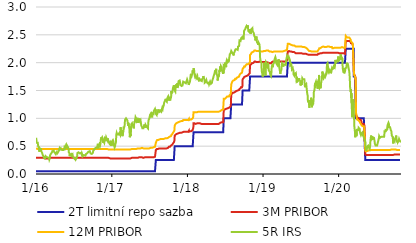
| Category | 2T limitní repo sazba | 3M PRIBOR | 12M PRIBOR | 5R IRS |
|---|---|---|---|---|
| 2016-01-04 | 0.05 | 0.29 | 0.46 | 0.65 |
| 2016-01-05 | 0.05 | 0.29 | 0.46 | 0.63 |
| 2016-01-06 | 0.05 | 0.29 | 0.46 | 0.62 |
| 2016-01-07 | 0.05 | 0.29 | 0.46 | 0.56 |
| 2016-01-08 | 0.05 | 0.29 | 0.46 | 0.57 |
| 2016-01-11 | 0.05 | 0.29 | 0.45 | 0.56 |
| 2016-01-12 | 0.05 | 0.29 | 0.45 | 0.56 |
| 2016-01-13 | 0.05 | 0.29 | 0.45 | 0.56 |
| 2016-01-14 | 0.05 | 0.29 | 0.45 | 0.5 |
| 2016-01-15 | 0.05 | 0.29 | 0.45 | 0.49 |
| 2016-01-18 | 0.05 | 0.29 | 0.45 | 0.46 |
| 2016-01-19 | 0.05 | 0.29 | 0.45 | 0.46 |
| 2016-01-20 | 0.05 | 0.29 | 0.45 | 0.4 |
| 2016-01-21 | 0.05 | 0.29 | 0.45 | 0.43 |
| 2016-01-22 | 0.05 | 0.29 | 0.45 | 0.46 |
| 2016-01-25 | 0.05 | 0.29 | 0.45 | 0.45 |
| 2016-01-26 | 0.05 | 0.29 | 0.45 | 0.44 |
| 2016-01-27 | 0.05 | 0.29 | 0.45 | 0.46 |
| 2016-01-28 | 0.05 | 0.29 | 0.45 | 0.44 |
| 2016-01-29 | 0.05 | 0.29 | 0.45 | 0.41 |
| 2016-02-01 | 0.05 | 0.29 | 0.45 | 0.4 |
| 2016-02-02 | 0.05 | 0.29 | 0.45 | 0.38 |
| 2016-02-03 | 0.05 | 0.29 | 0.45 | 0.37 |
| 2016-02-04 | 0.05 | 0.29 | 0.45 | 0.37 |
| 2016-02-05 | 0.05 | 0.29 | 0.45 | 0.34 |
| 2016-02-08 | 0.05 | 0.29 | 0.45 | 0.32 |
| 2016-02-09 | 0.05 | 0.28 | 0.45 | 0.31 |
| 2016-02-10 | 0.05 | 0.28 | 0.45 | 0.31 |
| 2016-02-11 | 0.05 | 0.28 | 0.45 | 0.29 |
| 2016-02-12 | 0.05 | 0.28 | 0.45 | 0.28 |
| 2016-02-15 | 0.05 | 0.28 | 0.45 | 0.28 |
| 2016-02-16 | 0.05 | 0.28 | 0.45 | 0.28 |
| 2016-02-17 | 0.05 | 0.28 | 0.45 | 0.28 |
| 2016-02-18 | 0.05 | 0.28 | 0.45 | 0.3 |
| 2016-02-19 | 0.05 | 0.28 | 0.45 | 0.32 |
| 2016-02-22 | 0.05 | 0.28 | 0.45 | 0.32 |
| 2016-02-23 | 0.05 | 0.28 | 0.45 | 0.32 |
| 2016-02-24 | 0.05 | 0.28 | 0.45 | 0.3 |
| 2016-02-25 | 0.05 | 0.28 | 0.45 | 0.3 |
| 2016-02-26 | 0.05 | 0.28 | 0.45 | 0.31 |
| 2016-02-29 | 0.05 | 0.28 | 0.45 | 0.3 |
| 2016-03-01 | 0.05 | 0.28 | 0.45 | 0.29 |
| 2016-03-02 | 0.05 | 0.28 | 0.45 | 0.31 |
| 2016-03-03 | 0.05 | 0.28 | 0.45 | 0.3 |
| 2016-03-04 | 0.05 | 0.28 | 0.45 | 0.29 |
| 2016-03-07 | 0.05 | 0.28 | 0.45 | 0.28 |
| 2016-03-08 | 0.05 | 0.28 | 0.45 | 0.26 |
| 2016-03-09 | 0.05 | 0.28 | 0.45 | 0.26 |
| 2016-03-10 | 0.05 | 0.28 | 0.45 | 0.28 |
| 2016-03-11 | 0.05 | 0.29 | 0.45 | 0.33 |
| 2016-03-14 | 0.05 | 0.29 | 0.45 | 0.34 |
| 2016-03-15 | 0.05 | 0.29 | 0.45 | 0.36 |
| 2016-03-16 | 0.05 | 0.29 | 0.45 | 0.37 |
| 2016-03-17 | 0.05 | 0.29 | 0.45 | 0.37 |
| 2016-03-18 | 0.05 | 0.29 | 0.45 | 0.37 |
| 2016-03-21 | 0.05 | 0.29 | 0.45 | 0.39 |
| 2016-03-22 | 0.05 | 0.29 | 0.45 | 0.41 |
| 2016-03-23 | 0.05 | 0.29 | 0.45 | 0.41 |
| 2016-03-24 | 0.05 | 0.29 | 0.45 | 0.4 |
| 2016-03-29 | 0.05 | 0.29 | 0.45 | 0.42 |
| 2016-03-30 | 0.05 | 0.29 | 0.45 | 0.4 |
| 2016-03-31 | 0.05 | 0.29 | 0.45 | 0.4 |
| 2016-04-01 | 0.05 | 0.29 | 0.45 | 0.4 |
| 2016-04-04 | 0.05 | 0.29 | 0.45 | 0.38 |
| 2016-04-05 | 0.05 | 0.29 | 0.45 | 0.37 |
| 2016-04-06 | 0.05 | 0.29 | 0.45 | 0.38 |
| 2016-04-07 | 0.05 | 0.29 | 0.45 | 0.36 |
| 2016-04-08 | 0.05 | 0.29 | 0.45 | 0.36 |
| 2016-04-11 | 0.05 | 0.29 | 0.45 | 0.35 |
| 2016-04-12 | 0.05 | 0.29 | 0.45 | 0.39 |
| 2016-04-13 | 0.05 | 0.29 | 0.45 | 0.37 |
| 2016-04-14 | 0.05 | 0.29 | 0.45 | 0.39 |
| 2016-04-15 | 0.05 | 0.29 | 0.45 | 0.37 |
| 2016-04-18 | 0.05 | 0.29 | 0.45 | 0.37 |
| 2016-04-19 | 0.05 | 0.29 | 0.45 | 0.39 |
| 2016-04-20 | 0.05 | 0.29 | 0.45 | 0.38 |
| 2016-04-21 | 0.05 | 0.29 | 0.45 | 0.41 |
| 2016-04-22 | 0.05 | 0.29 | 0.45 | 0.41 |
| 2016-04-25 | 0.05 | 0.29 | 0.45 | 0.42 |
| 2016-04-26 | 0.05 | 0.29 | 0.45 | 0.46 |
| 2016-04-27 | 0.05 | 0.29 | 0.45 | 0.46 |
| 2016-04-28 | 0.05 | 0.29 | 0.45 | 0.44 |
| 2016-04-29 | 0.05 | 0.29 | 0.45 | 0.45 |
| 2016-05-02 | 0.05 | 0.29 | 0.45 | 0.46 |
| 2016-05-03 | 0.05 | 0.29 | 0.45 | 0.46 |
| 2016-05-04 | 0.05 | 0.29 | 0.45 | 0.44 |
| 2016-05-05 | 0.05 | 0.29 | 0.45 | 0.45 |
| 2016-05-06 | 0.05 | 0.29 | 0.45 | 0.44 |
| 2016-05-09 | 0.05 | 0.29 | 0.45 | 0.43 |
| 2016-05-10 | 0.05 | 0.29 | 0.45 | 0.44 |
| 2016-05-11 | 0.05 | 0.29 | 0.45 | 0.43 |
| 2016-05-12 | 0.05 | 0.29 | 0.45 | 0.42 |
| 2016-05-13 | 0.05 | 0.29 | 0.45 | 0.43 |
| 2016-05-16 | 0.05 | 0.29 | 0.45 | 0.43 |
| 2016-05-17 | 0.05 | 0.29 | 0.45 | 0.44 |
| 2016-05-18 | 0.05 | 0.29 | 0.45 | 0.44 |
| 2016-05-19 | 0.05 | 0.29 | 0.45 | 0.46 |
| 2016-05-20 | 0.05 | 0.29 | 0.45 | 0.48 |
| 2016-05-23 | 0.05 | 0.29 | 0.45 | 0.46 |
| 2016-05-24 | 0.05 | 0.29 | 0.45 | 0.46 |
| 2016-05-25 | 0.05 | 0.29 | 0.45 | 0.48 |
| 2016-05-26 | 0.05 | 0.29 | 0.45 | 0.48 |
| 2016-05-27 | 0.05 | 0.29 | 0.45 | 0.51 |
| 2016-05-30 | 0.05 | 0.29 | 0.45 | 0.49 |
| 2016-05-31 | 0.05 | 0.29 | 0.45 | 0.52 |
| 2016-06-01 | 0.05 | 0.29 | 0.45 | 0.51 |
| 2016-06-02 | 0.05 | 0.29 | 0.45 | 0.51 |
| 2016-06-03 | 0.05 | 0.29 | 0.45 | 0.51 |
| 2016-06-06 | 0.05 | 0.29 | 0.45 | 0.48 |
| 2016-06-07 | 0.05 | 0.29 | 0.45 | 0.49 |
| 2016-06-08 | 0.05 | 0.29 | 0.45 | 0.47 |
| 2016-06-09 | 0.05 | 0.29 | 0.45 | 0.45 |
| 2016-06-10 | 0.05 | 0.29 | 0.45 | 0.39 |
| 2016-06-13 | 0.05 | 0.29 | 0.45 | 0.37 |
| 2016-06-14 | 0.05 | 0.29 | 0.45 | 0.32 |
| 2016-06-15 | 0.05 | 0.29 | 0.45 | 0.32 |
| 2016-06-16 | 0.05 | 0.29 | 0.45 | 0.32 |
| 2016-06-17 | 0.05 | 0.29 | 0.45 | 0.35 |
| 2016-06-20 | 0.05 | 0.29 | 0.45 | 0.35 |
| 2016-06-21 | 0.05 | 0.29 | 0.45 | 0.36 |
| 2016-06-22 | 0.05 | 0.29 | 0.45 | 0.36 |
| 2016-06-23 | 0.05 | 0.29 | 0.45 | 0.36 |
| 2016-06-24 | 0.05 | 0.29 | 0.45 | 0.33 |
| 2016-06-27 | 0.05 | 0.29 | 0.45 | 0.32 |
| 2016-06-28 | 0.05 | 0.29 | 0.45 | 0.35 |
| 2016-06-29 | 0.05 | 0.29 | 0.45 | 0.33 |
| 2016-06-30 | 0.05 | 0.29 | 0.45 | 0.31 |
| 2016-07-01 | 0.05 | 0.29 | 0.45 | 0.31 |
| 2016-07-04 | 0.05 | 0.29 | 0.45 | 0.29 |
| 2016-07-07 | 0.05 | 0.29 | 0.45 | 0.28 |
| 2016-07-08 | 0.05 | 0.29 | 0.45 | 0.28 |
| 2016-07-11 | 0.05 | 0.29 | 0.45 | 0.26 |
| 2016-07-12 | 0.05 | 0.29 | 0.45 | 0.3 |
| 2016-07-13 | 0.05 | 0.29 | 0.45 | 0.29 |
| 2016-07-14 | 0.05 | 0.29 | 0.45 | 0.27 |
| 2016-07-15 | 0.05 | 0.29 | 0.45 | 0.28 |
| 2016-07-18 | 0.05 | 0.29 | 0.45 | 0.29 |
| 2016-07-19 | 0.05 | 0.29 | 0.45 | 0.28 |
| 2016-07-20 | 0.05 | 0.29 | 0.45 | 0.32 |
| 2016-07-21 | 0.05 | 0.29 | 0.45 | 0.36 |
| 2016-07-22 | 0.05 | 0.29 | 0.45 | 0.38 |
| 2016-07-25 | 0.05 | 0.29 | 0.45 | 0.38 |
| 2016-07-26 | 0.05 | 0.29 | 0.45 | 0.38 |
| 2016-07-27 | 0.05 | 0.29 | 0.45 | 0.39 |
| 2016-07-28 | 0.05 | 0.29 | 0.45 | 0.38 |
| 2016-07-29 | 0.05 | 0.29 | 0.45 | 0.38 |
| 2016-08-01 | 0.05 | 0.29 | 0.45 | 0.37 |
| 2016-08-02 | 0.05 | 0.29 | 0.45 | 0.37 |
| 2016-08-03 | 0.05 | 0.29 | 0.45 | 0.37 |
| 2016-08-04 | 0.05 | 0.29 | 0.45 | 0.38 |
| 2016-08-05 | 0.05 | 0.29 | 0.45 | 0.38 |
| 2016-08-08 | 0.05 | 0.29 | 0.45 | 0.38 |
| 2016-08-09 | 0.05 | 0.29 | 0.45 | 0.37 |
| 2016-08-10 | 0.05 | 0.29 | 0.45 | 0.37 |
| 2016-08-11 | 0.05 | 0.29 | 0.45 | 0.35 |
| 2016-08-12 | 0.05 | 0.29 | 0.45 | 0.37 |
| 2016-08-15 | 0.05 | 0.29 | 0.45 | 0.34 |
| 2016-08-16 | 0.05 | 0.29 | 0.45 | 0.32 |
| 2016-08-17 | 0.05 | 0.29 | 0.45 | 0.33 |
| 2016-08-18 | 0.05 | 0.29 | 0.45 | 0.33 |
| 2016-08-19 | 0.05 | 0.29 | 0.45 | 0.33 |
| 2016-08-22 | 0.05 | 0.29 | 0.45 | 0.34 |
| 2016-08-23 | 0.05 | 0.29 | 0.45 | 0.33 |
| 2016-08-24 | 0.05 | 0.29 | 0.45 | 0.33 |
| 2016-08-25 | 0.05 | 0.29 | 0.45 | 0.33 |
| 2016-08-26 | 0.05 | 0.29 | 0.45 | 0.33 |
| 2016-08-29 | 0.05 | 0.29 | 0.45 | 0.33 |
| 2016-08-30 | 0.05 | 0.29 | 0.45 | 0.33 |
| 2016-08-31 | 0.05 | 0.29 | 0.45 | 0.34 |
| 2016-09-01 | 0.05 | 0.29 | 0.45 | 0.36 |
| 2016-09-02 | 0.05 | 0.29 | 0.45 | 0.36 |
| 2016-09-05 | 0.05 | 0.29 | 0.45 | 0.37 |
| 2016-09-06 | 0.05 | 0.29 | 0.45 | 0.37 |
| 2016-09-07 | 0.05 | 0.29 | 0.45 | 0.36 |
| 2016-09-08 | 0.05 | 0.29 | 0.45 | 0.36 |
| 2016-09-09 | 0.05 | 0.29 | 0.45 | 0.38 |
| 2016-09-12 | 0.05 | 0.29 | 0.45 | 0.4 |
| 2016-09-13 | 0.05 | 0.29 | 0.45 | 0.4 |
| 2016-09-14 | 0.05 | 0.29 | 0.45 | 0.4 |
| 2016-09-15 | 0.05 | 0.29 | 0.45 | 0.41 |
| 2016-09-16 | 0.05 | 0.29 | 0.45 | 0.41 |
| 2016-09-19 | 0.05 | 0.29 | 0.45 | 0.41 |
| 2016-09-20 | 0.05 | 0.29 | 0.45 | 0.41 |
| 2016-09-21 | 0.05 | 0.29 | 0.45 | 0.39 |
| 2016-09-22 | 0.05 | 0.29 | 0.45 | 0.38 |
| 2016-09-23 | 0.05 | 0.29 | 0.45 | 0.37 |
| 2016-09-26 | 0.05 | 0.29 | 0.45 | 0.36 |
| 2016-09-27 | 0.05 | 0.29 | 0.45 | 0.36 |
| 2016-09-29 | 0.05 | 0.29 | 0.45 | 0.36 |
| 2016-09-30 | 0.05 | 0.29 | 0.45 | 0.36 |
| 2016-10-03 | 0.05 | 0.29 | 0.45 | 0.37 |
| 2016-10-04 | 0.05 | 0.29 | 0.45 | 0.38 |
| 2016-10-05 | 0.05 | 0.29 | 0.45 | 0.39 |
| 2016-10-06 | 0.05 | 0.29 | 0.45 | 0.42 |
| 2016-10-07 | 0.05 | 0.29 | 0.45 | 0.42 |
| 2016-10-10 | 0.05 | 0.29 | 0.45 | 0.43 |
| 2016-10-11 | 0.05 | 0.29 | 0.45 | 0.44 |
| 2016-10-12 | 0.05 | 0.29 | 0.45 | 0.44 |
| 2016-10-13 | 0.05 | 0.29 | 0.45 | 0.45 |
| 2016-10-14 | 0.05 | 0.29 | 0.45 | 0.45 |
| 2016-10-17 | 0.05 | 0.29 | 0.45 | 0.47 |
| 2016-10-18 | 0.05 | 0.29 | 0.45 | 0.47 |
| 2016-10-19 | 0.05 | 0.29 | 0.45 | 0.47 |
| 2016-10-20 | 0.05 | 0.29 | 0.45 | 0.48 |
| 2016-10-21 | 0.05 | 0.29 | 0.45 | 0.48 |
| 2016-10-24 | 0.05 | 0.29 | 0.45 | 0.48 |
| 2016-10-25 | 0.05 | 0.29 | 0.45 | 0.46 |
| 2016-10-26 | 0.05 | 0.29 | 0.45 | 0.48 |
| 2016-10-27 | 0.05 | 0.29 | 0.45 | 0.53 |
| 2016-10-31 | 0.05 | 0.29 | 0.45 | 0.54 |
| 2016-11-01 | 0.05 | 0.29 | 0.45 | 0.53 |
| 2016-11-02 | 0.05 | 0.29 | 0.45 | 0.51 |
| 2016-11-03 | 0.05 | 0.29 | 0.45 | 0.52 |
| 2016-11-04 | 0.05 | 0.29 | 0.45 | 0.53 |
| 2016-11-07 | 0.05 | 0.29 | 0.45 | 0.5 |
| 2016-11-08 | 0.05 | 0.29 | 0.45 | 0.49 |
| 2016-11-09 | 0.05 | 0.29 | 0.45 | 0.51 |
| 2016-11-10 | 0.05 | 0.29 | 0.45 | 0.55 |
| 2016-11-11 | 0.05 | 0.29 | 0.45 | 0.61 |
| 2016-11-14 | 0.05 | 0.29 | 0.45 | 0.66 |
| 2016-11-15 | 0.05 | 0.29 | 0.45 | 0.64 |
| 2016-11-16 | 0.05 | 0.29 | 0.45 | 0.65 |
| 2016-11-18 | 0.05 | 0.29 | 0.45 | 0.66 |
| 2016-11-21 | 0.05 | 0.29 | 0.45 | 0.63 |
| 2016-11-22 | 0.05 | 0.29 | 0.45 | 0.6 |
| 2016-11-23 | 0.05 | 0.29 | 0.45 | 0.56 |
| 2016-11-24 | 0.05 | 0.29 | 0.45 | 0.59 |
| 2016-11-25 | 0.05 | 0.29 | 0.45 | 0.59 |
| 2016-11-28 | 0.05 | 0.29 | 0.45 | 0.56 |
| 2016-11-29 | 0.05 | 0.29 | 0.45 | 0.56 |
| 2016-11-30 | 0.05 | 0.29 | 0.45 | 0.57 |
| 2016-12-01 | 0.05 | 0.29 | 0.45 | 0.64 |
| 2016-12-02 | 0.05 | 0.29 | 0.45 | 0.63 |
| 2016-12-05 | 0.05 | 0.29 | 0.45 | 0.62 |
| 2016-12-06 | 0.05 | 0.29 | 0.45 | 0.64 |
| 2016-12-07 | 0.05 | 0.29 | 0.45 | 0.66 |
| 2016-12-08 | 0.05 | 0.29 | 0.45 | 0.66 |
| 2016-12-09 | 0.05 | 0.29 | 0.45 | 0.64 |
| 2016-12-12 | 0.05 | 0.29 | 0.45 | 0.65 |
| 2016-12-13 | 0.05 | 0.29 | 0.45 | 0.63 |
| 2016-12-14 | 0.05 | 0.29 | 0.45 | 0.6 |
| 2016-12-15 | 0.05 | 0.29 | 0.45 | 0.64 |
| 2016-12-16 | 0.05 | 0.29 | 0.45 | 0.62 |
| 2016-12-19 | 0.05 | 0.29 | 0.44 | 0.59 |
| 2016-12-20 | 0.05 | 0.29 | 0.44 | 0.57 |
| 2016-12-21 | 0.05 | 0.29 | 0.44 | 0.56 |
| 2016-12-22 | 0.05 | 0.28 | 0.44 | 0.57 |
| 2016-12-23 | 0.05 | 0.28 | 0.44 | 0.55 |
| 2016-12-27 | 0.05 | 0.28 | 0.44 | 0.57 |
| 2016-12-28 | 0.05 | 0.27 | 0.43 | 0.54 |
| 2016-12-29 | 0.05 | 0.28 | 0.44 | 0.52 |
| 2016-12-30 | 0.05 | 0.28 | 0.44 | 0.52 |
| 2017-01-02 | 0.05 | 0.28 | 0.44 | 0.52 |
| 2017-01-03 | 0.05 | 0.28 | 0.44 | 0.52 |
| 2017-01-04 | 0.05 | 0.28 | 0.44 | 0.57 |
| 2017-01-05 | 0.05 | 0.28 | 0.44 | 0.59 |
| 2017-01-06 | 0.05 | 0.28 | 0.44 | 0.58 |
| 2017-01-09 | 0.05 | 0.28 | 0.44 | 0.61 |
| 2017-01-10 | 0.05 | 0.28 | 0.44 | 0.6 |
| 2017-01-11 | 0.05 | 0.28 | 0.44 | 0.59 |
| 2017-01-12 | 0.05 | 0.28 | 0.44 | 0.56 |
| 2017-01-13 | 0.05 | 0.28 | 0.44 | 0.52 |
| 2017-01-16 | 0.05 | 0.28 | 0.44 | 0.5 |
| 2017-01-17 | 0.05 | 0.28 | 0.44 | 0.48 |
| 2017-01-18 | 0.05 | 0.28 | 0.44 | 0.48 |
| 2017-01-19 | 0.05 | 0.28 | 0.44 | 0.5 |
| 2017-01-20 | 0.05 | 0.28 | 0.44 | 0.53 |
| 2017-01-23 | 0.05 | 0.28 | 0.44 | 0.56 |
| 2017-01-24 | 0.05 | 0.28 | 0.44 | 0.62 |
| 2017-01-25 | 0.05 | 0.28 | 0.44 | 0.7 |
| 2017-01-26 | 0.05 | 0.28 | 0.44 | 0.7 |
| 2017-01-27 | 0.05 | 0.28 | 0.44 | 0.74 |
| 2017-01-30 | 0.05 | 0.28 | 0.44 | 0.71 |
| 2017-01-31 | 0.05 | 0.28 | 0.44 | 0.71 |
| 2017-02-01 | 0.05 | 0.28 | 0.44 | 0.7 |
| 2017-02-02 | 0.05 | 0.28 | 0.44 | 0.72 |
| 2017-02-03 | 0.05 | 0.28 | 0.44 | 0.71 |
| 2017-02-06 | 0.05 | 0.28 | 0.44 | 0.71 |
| 2017-02-07 | 0.05 | 0.28 | 0.44 | 0.74 |
| 2017-02-08 | 0.05 | 0.28 | 0.44 | 0.75 |
| 2017-02-09 | 0.05 | 0.28 | 0.44 | 0.7 |
| 2017-02-10 | 0.05 | 0.28 | 0.44 | 0.72 |
| 2017-02-13 | 0.05 | 0.28 | 0.44 | 0.7 |
| 2017-02-14 | 0.05 | 0.28 | 0.44 | 0.77 |
| 2017-02-15 | 0.05 | 0.28 | 0.44 | 0.84 |
| 2017-02-16 | 0.05 | 0.28 | 0.44 | 0.83 |
| 2017-02-17 | 0.05 | 0.28 | 0.44 | 0.76 |
| 2017-02-20 | 0.05 | 0.28 | 0.44 | 0.79 |
| 2017-02-21 | 0.05 | 0.28 | 0.44 | 0.8 |
| 2017-02-22 | 0.05 | 0.28 | 0.44 | 0.78 |
| 2017-02-23 | 0.05 | 0.28 | 0.44 | 0.7 |
| 2017-02-24 | 0.05 | 0.28 | 0.44 | 0.68 |
| 2017-02-27 | 0.05 | 0.28 | 0.44 | 0.68 |
| 2017-02-28 | 0.05 | 0.28 | 0.44 | 0.77 |
| 2017-03-01 | 0.05 | 0.28 | 0.44 | 0.77 |
| 2017-03-02 | 0.05 | 0.28 | 0.44 | 0.85 |
| 2017-03-03 | 0.05 | 0.28 | 0.44 | 0.83 |
| 2017-03-06 | 0.05 | 0.28 | 0.44 | 0.86 |
| 2017-03-07 | 0.05 | 0.28 | 0.44 | 0.87 |
| 2017-03-08 | 0.05 | 0.28 | 0.44 | 0.96 |
| 2017-03-09 | 0.05 | 0.28 | 0.44 | 0.98 |
| 2017-03-10 | 0.05 | 0.28 | 0.44 | 0.99 |
| 2017-03-13 | 0.05 | 0.28 | 0.44 | 1 |
| 2017-03-14 | 0.05 | 0.28 | 0.44 | 1 |
| 2017-03-15 | 0.05 | 0.28 | 0.44 | 0.99 |
| 2017-03-16 | 0.05 | 0.28 | 0.44 | 0.99 |
| 2017-03-17 | 0.05 | 0.28 | 0.44 | 0.99 |
| 2017-03-20 | 0.05 | 0.28 | 0.44 | 0.96 |
| 2017-03-21 | 0.05 | 0.28 | 0.44 | 0.97 |
| 2017-03-22 | 0.05 | 0.28 | 0.44 | 0.9 |
| 2017-03-23 | 0.05 | 0.28 | 0.44 | 0.87 |
| 2017-03-24 | 0.05 | 0.28 | 0.44 | 0.92 |
| 2017-03-27 | 0.05 | 0.28 | 0.44 | 0.86 |
| 2017-03-28 | 0.05 | 0.28 | 0.44 | 0.84 |
| 2017-03-29 | 0.05 | 0.28 | 0.44 | 0.84 |
| 2017-03-30 | 0.05 | 0.28 | 0.44 | 0.8 |
| 2017-03-31 | 0.05 | 0.28 | 0.44 | 0.66 |
| 2017-04-03 | 0.05 | 0.28 | 0.44 | 0.71 |
| 2017-04-04 | 0.05 | 0.28 | 0.44 | 0.68 |
| 2017-04-05 | 0.05 | 0.28 | 0.44 | 0.73 |
| 2017-04-06 | 0.05 | 0.28 | 0.44 | 0.76 |
| 2017-04-07 | 0.05 | 0.29 | 0.44 | 0.89 |
| 2017-04-10 | 0.05 | 0.29 | 0.45 | 0.89 |
| 2017-04-11 | 0.05 | 0.29 | 0.45 | 0.91 |
| 2017-04-12 | 0.05 | 0.29 | 0.45 | 0.89 |
| 2017-04-13 | 0.05 | 0.29 | 0.45 | 0.88 |
| 2017-04-18 | 0.05 | 0.29 | 0.45 | 0.85 |
| 2017-04-19 | 0.05 | 0.29 | 0.45 | 0.82 |
| 2017-04-20 | 0.05 | 0.29 | 0.45 | 0.87 |
| 2017-04-21 | 0.05 | 0.29 | 0.45 | 0.88 |
| 2017-04-24 | 0.05 | 0.29 | 0.45 | 0.95 |
| 2017-04-25 | 0.05 | 0.29 | 0.45 | 0.93 |
| 2017-04-26 | 0.05 | 0.29 | 0.45 | 0.94 |
| 2017-04-27 | 0.05 | 0.29 | 0.45 | 0.99 |
| 2017-04-28 | 0.05 | 0.29 | 0.45 | 1.02 |
| 2017-05-02 | 0.05 | 0.29 | 0.45 | 1.02 |
| 2017-05-03 | 0.05 | 0.29 | 0.45 | 0.98 |
| 2017-05-04 | 0.05 | 0.29 | 0.45 | 1.01 |
| 2017-05-05 | 0.05 | 0.29 | 0.45 | 0.95 |
| 2017-05-09 | 0.05 | 0.29 | 0.46 | 0.97 |
| 2017-05-10 | 0.05 | 0.29 | 0.46 | 0.92 |
| 2017-05-11 | 0.05 | 0.3 | 0.46 | 0.94 |
| 2017-05-12 | 0.05 | 0.3 | 0.46 | 0.96 |
| 2017-05-15 | 0.05 | 0.3 | 0.46 | 0.96 |
| 2017-05-16 | 0.05 | 0.3 | 0.46 | 1 |
| 2017-05-17 | 0.05 | 0.3 | 0.46 | 0.97 |
| 2017-05-18 | 0.05 | 0.3 | 0.46 | 0.95 |
| 2017-05-19 | 0.05 | 0.3 | 0.46 | 0.96 |
| 2017-05-22 | 0.05 | 0.3 | 0.46 | 0.97 |
| 2017-05-23 | 0.05 | 0.3 | 0.46 | 0.94 |
| 2017-05-24 | 0.05 | 0.3 | 0.47 | 0.92 |
| 2017-05-25 | 0.05 | 0.3 | 0.47 | 0.89 |
| 2017-05-26 | 0.05 | 0.3 | 0.47 | 0.87 |
| 2017-05-29 | 0.05 | 0.3 | 0.47 | 0.87 |
| 2017-05-30 | 0.05 | 0.3 | 0.46 | 0.84 |
| 2017-05-31 | 0.05 | 0.3 | 0.46 | 0.82 |
| 2017-06-01 | 0.05 | 0.3 | 0.46 | 0.81 |
| 2017-06-02 | 0.05 | 0.29 | 0.46 | 0.81 |
| 2017-06-05 | 0.05 | 0.29 | 0.46 | 0.82 |
| 2017-06-06 | 0.05 | 0.29 | 0.46 | 0.82 |
| 2017-06-07 | 0.05 | 0.29 | 0.46 | 0.81 |
| 2017-06-08 | 0.05 | 0.29 | 0.46 | 0.85 |
| 2017-06-09 | 0.05 | 0.3 | 0.46 | 0.89 |
| 2017-06-12 | 0.05 | 0.3 | 0.46 | 0.86 |
| 2017-06-13 | 0.05 | 0.3 | 0.46 | 0.87 |
| 2017-06-14 | 0.05 | 0.3 | 0.46 | 0.87 |
| 2017-06-15 | 0.05 | 0.3 | 0.46 | 0.83 |
| 2017-06-16 | 0.05 | 0.3 | 0.46 | 0.88 |
| 2017-06-19 | 0.05 | 0.3 | 0.46 | 0.86 |
| 2017-06-20 | 0.05 | 0.3 | 0.46 | 0.86 |
| 2017-06-21 | 0.05 | 0.3 | 0.46 | 0.86 |
| 2017-06-22 | 0.05 | 0.3 | 0.46 | 0.86 |
| 2017-06-23 | 0.05 | 0.3 | 0.46 | 0.84 |
| 2017-06-26 | 0.05 | 0.3 | 0.46 | 0.83 |
| 2017-06-27 | 0.05 | 0.3 | 0.46 | 0.82 |
| 2017-06-28 | 0.05 | 0.3 | 0.46 | 0.89 |
| 2017-06-29 | 0.05 | 0.29 | 0.46 | 0.94 |
| 2017-06-30 | 0.05 | 0.3 | 0.46 | 0.97 |
| 2017-07-03 | 0.05 | 0.3 | 0.46 | 0.99 |
| 2017-07-04 | 0.05 | 0.3 | 0.46 | 0.98 |
| 2017-07-07 | 0.05 | 0.3 | 0.47 | 1.06 |
| 2017-07-10 | 0.05 | 0.3 | 0.47 | 1.08 |
| 2017-07-11 | 0.05 | 0.3 | 0.47 | 1.05 |
| 2017-07-12 | 0.05 | 0.3 | 0.47 | 1.05 |
| 2017-07-13 | 0.05 | 0.3 | 0.47 | 1.03 |
| 2017-07-14 | 0.05 | 0.3 | 0.47 | 1.03 |
| 2017-07-17 | 0.05 | 0.3 | 0.47 | 1.03 |
| 2017-07-18 | 0.05 | 0.3 | 0.47 | 1.03 |
| 2017-07-19 | 0.05 | 0.3 | 0.47 | 1.09 |
| 2017-07-20 | 0.05 | 0.3 | 0.48 | 1.1 |
| 2017-07-21 | 0.05 | 0.3 | 0.48 | 1.08 |
| 2017-07-24 | 0.05 | 0.3 | 0.48 | 1.08 |
| 2017-07-25 | 0.05 | 0.3 | 0.48 | 1.13 |
| 2017-07-26 | 0.05 | 0.3 | 0.48 | 1.14 |
| 2017-07-27 | 0.05 | 0.3 | 0.48 | 1.14 |
| 2017-07-28 | 0.05 | 0.31 | 0.48 | 1.15 |
| 2017-07-31 | 0.05 | 0.31 | 0.49 | 1.17 |
| 2017-08-01 | 0.05 | 0.31 | 0.49 | 1.18 |
| 2017-08-02 | 0.05 | 0.31 | 0.49 | 1.14 |
| 2017-08-03 | 0.05 | 0.31 | 0.49 | 1.16 |
| 2017-08-04 | 0.25 | 0.43 | 0.56 | 1.08 |
| 2017-08-07 | 0.25 | 0.44 | 0.59 | 1.07 |
| 2017-08-08 | 0.25 | 0.44 | 0.6 | 1.06 |
| 2017-08-09 | 0.25 | 0.45 | 0.6 | 1.09 |
| 2017-08-10 | 0.25 | 0.45 | 0.61 | 1.07 |
| 2017-08-11 | 0.25 | 0.45 | 0.61 | 1.09 |
| 2017-08-14 | 0.25 | 0.45 | 0.61 | 1.11 |
| 2017-08-15 | 0.25 | 0.45 | 0.61 | 1.11 |
| 2017-08-16 | 0.25 | 0.45 | 0.62 | 1.16 |
| 2017-08-17 | 0.25 | 0.46 | 0.62 | 1.14 |
| 2017-08-18 | 0.25 | 0.46 | 0.62 | 1.14 |
| 2017-08-21 | 0.25 | 0.46 | 0.62 | 1.14 |
| 2017-08-22 | 0.25 | 0.46 | 0.63 | 1.12 |
| 2017-08-23 | 0.25 | 0.46 | 0.63 | 1.13 |
| 2017-08-24 | 0.25 | 0.46 | 0.63 | 1.13 |
| 2017-08-25 | 0.25 | 0.46 | 0.63 | 1.14 |
| 2017-08-28 | 0.25 | 0.46 | 0.63 | 1.14 |
| 2017-08-29 | 0.25 | 0.46 | 0.63 | 1.14 |
| 2017-08-30 | 0.25 | 0.46 | 0.63 | 1.12 |
| 2017-08-31 | 0.25 | 0.46 | 0.63 | 1.14 |
| 2017-09-01 | 0.25 | 0.46 | 0.63 | 1.15 |
| 2017-09-04 | 0.25 | 0.46 | 0.63 | 1.19 |
| 2017-09-05 | 0.25 | 0.46 | 0.63 | 1.19 |
| 2017-09-06 | 0.25 | 0.46 | 0.63 | 1.17 |
| 2017-09-07 | 0.25 | 0.46 | 0.63 | 1.19 |
| 2017-09-08 | 0.25 | 0.46 | 0.63 | 1.2 |
| 2017-09-11 | 0.25 | 0.46 | 0.63 | 1.23 |
| 2017-09-12 | 0.25 | 0.46 | 0.64 | 1.24 |
| 2017-09-13 | 0.25 | 0.46 | 0.64 | 1.28 |
| 2017-09-14 | 0.25 | 0.46 | 0.64 | 1.28 |
| 2017-09-15 | 0.25 | 0.46 | 0.64 | 1.3 |
| 2017-09-18 | 0.25 | 0.46 | 0.64 | 1.3 |
| 2017-09-19 | 0.25 | 0.46 | 0.64 | 1.33 |
| 2017-09-20 | 0.25 | 0.46 | 0.64 | 1.32 |
| 2017-09-21 | 0.25 | 0.46 | 0.64 | 1.35 |
| 2017-09-22 | 0.25 | 0.46 | 0.64 | 1.32 |
| 2017-09-25 | 0.25 | 0.46 | 0.64 | 1.31 |
| 2017-09-26 | 0.25 | 0.46 | 0.64 | 1.3 |
| 2017-09-27 | 0.25 | 0.47 | 0.64 | 1.33 |
| 2017-09-29 | 0.25 | 0.47 | 0.65 | 1.37 |
| 2017-10-02 | 0.25 | 0.47 | 0.65 | 1.39 |
| 2017-10-03 | 0.25 | 0.47 | 0.65 | 1.39 |
| 2017-10-04 | 0.25 | 0.47 | 0.65 | 1.36 |
| 2017-10-05 | 0.25 | 0.48 | 0.66 | 1.32 |
| 2017-10-06 | 0.25 | 0.49 | 0.66 | 1.38 |
| 2017-10-09 | 0.25 | 0.49 | 0.67 | 1.36 |
| 2017-10-10 | 0.25 | 0.49 | 0.67 | 1.35 |
| 2017-10-11 | 0.25 | 0.49 | 0.66 | 1.37 |
| 2017-10-12 | 0.25 | 0.49 | 0.66 | 1.32 |
| 2017-10-13 | 0.25 | 0.5 | 0.67 | 1.35 |
| 2017-10-16 | 0.25 | 0.51 | 0.68 | 1.37 |
| 2017-10-17 | 0.25 | 0.51 | 0.69 | 1.4 |
| 2017-10-18 | 0.25 | 0.52 | 0.7 | 1.49 |
| 2017-10-19 | 0.25 | 0.52 | 0.71 | 1.45 |
| 2017-10-20 | 0.25 | 0.52 | 0.71 | 1.46 |
| 2017-10-23 | 0.25 | 0.53 | 0.72 | 1.47 |
| 2017-10-24 | 0.25 | 0.54 | 0.72 | 1.47 |
| 2017-10-25 | 0.25 | 0.54 | 0.73 | 1.53 |
| 2017-10-26 | 0.25 | 0.55 | 0.74 | 1.55 |
| 2017-10-27 | 0.25 | 0.56 | 0.74 | 1.56 |
| 2017-10-30 | 0.25 | 0.57 | 0.75 | 1.59 |
| 2017-10-31 | 0.25 | 0.58 | 0.77 | 1.52 |
| 2017-11-01 | 0.25 | 0.59 | 0.77 | 1.53 |
| 2017-11-02 | 0.25 | 0.61 | 0.79 | 1.59 |
| 2017-11-03 | 0.5 | 0.69 | 0.87 | 1.5 |
| 2017-11-06 | 0.5 | 0.7 | 0.89 | 1.48 |
| 2017-11-07 | 0.5 | 0.7 | 0.89 | 1.53 |
| 2017-11-08 | 0.5 | 0.71 | 0.89 | 1.52 |
| 2017-11-09 | 0.5 | 0.72 | 0.9 | 1.57 |
| 2017-11-10 | 0.5 | 0.72 | 0.91 | 1.61 |
| 2017-11-13 | 0.5 | 0.72 | 0.91 | 1.56 |
| 2017-11-14 | 0.5 | 0.72 | 0.92 | 1.59 |
| 2017-11-15 | 0.5 | 0.72 | 0.92 | 1.55 |
| 2017-11-16 | 0.5 | 0.72 | 0.93 | 1.63 |
| 2017-11-20 | 0.5 | 0.73 | 0.93 | 1.6 |
| 2017-11-21 | 0.5 | 0.73 | 0.94 | 1.65 |
| 2017-11-22 | 0.5 | 0.73 | 0.94 | 1.67 |
| 2017-11-23 | 0.5 | 0.73 | 0.94 | 1.68 |
| 2017-11-24 | 0.5 | 0.74 | 0.94 | 1.68 |
| 2017-11-27 | 0.5 | 0.74 | 0.94 | 1.68 |
| 2017-11-28 | 0.5 | 0.74 | 0.94 | 1.68 |
| 2017-11-29 | 0.5 | 0.74 | 0.95 | 1.65 |
| 2017-11-30 | 0.5 | 0.74 | 0.95 | 1.66 |
| 2017-12-01 | 0.5 | 0.74 | 0.94 | 1.6 |
| 2017-12-04 | 0.5 | 0.74 | 0.95 | 1.6 |
| 2017-12-05 | 0.5 | 0.74 | 0.95 | 1.59 |
| 2017-12-06 | 0.5 | 0.74 | 0.95 | 1.58 |
| 2017-12-07 | 0.5 | 0.74 | 0.95 | 1.57 |
| 2017-12-08 | 0.5 | 0.75 | 0.95 | 1.57 |
| 2017-12-11 | 0.5 | 0.75 | 0.95 | 1.59 |
| 2017-12-12 | 0.5 | 0.75 | 0.95 | 1.59 |
| 2017-12-13 | 0.5 | 0.75 | 0.96 | 1.64 |
| 2017-12-14 | 0.5 | 0.76 | 0.97 | 1.66 |
| 2017-12-15 | 0.5 | 0.76 | 0.97 | 1.66 |
| 2017-12-18 | 0.5 | 0.76 | 0.97 | 1.66 |
| 2017-12-19 | 0.5 | 0.76 | 0.97 | 1.65 |
| 2017-12-20 | 0.5 | 0.76 | 0.97 | 1.66 |
| 2017-12-21 | 0.5 | 0.76 | 0.97 | 1.66 |
| 2017-12-22 | 0.5 | 0.76 | 0.97 | 1.66 |
| 2017-12-27 | 0.5 | 0.76 | 0.97 | 1.63 |
| 2017-12-28 | 0.5 | 0.76 | 0.97 | 1.64 |
| 2017-12-29 | 0.5 | 0.76 | 0.97 | 1.64 |
| 2018-01-02 | 0.5 | 0.76 | 0.97 | 1.7 |
| 2018-01-03 | 0.5 | 0.76 | 0.97 | 1.69 |
| 2018-01-04 | 0.5 | 0.76 | 0.97 | 1.68 |
| 2018-01-05 | 0.5 | 0.76 | 0.97 | 1.65 |
| 2018-01-08 | 0.5 | 0.76 | 0.97 | 1.63 |
| 2018-01-09 | 0.5 | 0.76 | 0.97 | 1.63 |
| 2018-01-10 | 0.5 | 0.76 | 0.97 | 1.6 |
| 2018-01-11 | 0.5 | 0.78 | 0.99 | 1.59 |
| 2018-01-12 | 0.5 | 0.76 | 0.97 | 1.63 |
| 2018-01-15 | 0.5 | 0.76 | 0.97 | 1.65 |
| 2018-01-16 | 0.5 | 0.76 | 0.97 | 1.66 |
| 2018-01-17 | 0.5 | 0.77 | 0.98 | 1.69 |
| 2018-01-18 | 0.5 | 0.77 | 0.98 | 1.75 |
| 2018-01-19 | 0.5 | 0.77 | 0.98 | 1.77 |
| 2018-01-22 | 0.5 | 0.77 | 0.98 | 1.77 |
| 2018-01-23 | 0.5 | 0.77 | 0.98 | 1.75 |
| 2018-01-24 | 0.5 | 0.77 | 0.98 | 1.75 |
| 2018-01-25 | 0.5 | 0.78 | 0.99 | 1.75 |
| 2018-01-26 | 0.5 | 0.78 | 0.99 | 1.79 |
| 2018-01-29 | 0.5 | 0.79 | 1 | 1.86 |
| 2018-01-30 | 0.5 | 0.81 | 1.01 | 1.84 |
| 2018-01-31 | 0.5 | 0.81 | 1.02 | 1.82 |
| 2018-02-01 | 0.5 | 0.83 | 1.03 | 1.86 |
| 2018-02-02 | 0.75 | 0.91 | 1.11 | 1.9 |
| 2018-02-05 | 0.75 | 0.91 | 1.11 | 1.86 |
| 2018-02-06 | 0.75 | 0.91 | 1.11 | 1.8 |
| 2018-02-07 | 0.75 | 0.91 | 1.11 | 1.79 |
| 2018-02-08 | 0.75 | 0.91 | 1.11 | 1.81 |
| 2018-02-09 | 0.75 | 0.9 | 1.11 | 1.75 |
| 2018-02-12 | 0.75 | 0.9 | 1.11 | 1.77 |
| 2018-02-13 | 0.75 | 0.9 | 1.11 | 1.75 |
| 2018-02-14 | 0.75 | 0.9 | 1.11 | 1.72 |
| 2018-02-15 | 0.75 | 0.9 | 1.11 | 1.76 |
| 2018-02-16 | 0.75 | 0.9 | 1.11 | 1.73 |
| 2018-02-19 | 0.75 | 0.91 | 1.11 | 1.72 |
| 2018-02-20 | 0.75 | 0.91 | 1.11 | 1.76 |
| 2018-02-21 | 0.75 | 0.91 | 1.11 | 1.73 |
| 2018-02-22 | 0.75 | 0.91 | 1.12 | 1.71 |
| 2018-02-23 | 0.75 | 0.91 | 1.12 | 1.71 |
| 2018-02-26 | 0.75 | 0.91 | 1.12 | 1.69 |
| 2018-02-27 | 0.75 | 0.91 | 1.12 | 1.71 |
| 2018-02-28 | 0.75 | 0.91 | 1.12 | 1.73 |
| 2018-03-01 | 0.75 | 0.91 | 1.12 | 1.7 |
| 2018-03-02 | 0.75 | 0.91 | 1.12 | 1.68 |
| 2018-03-05 | 0.75 | 0.91 | 1.12 | 1.67 |
| 2018-03-06 | 0.75 | 0.91 | 1.12 | 1.69 |
| 2018-03-07 | 0.75 | 0.91 | 1.12 | 1.69 |
| 2018-03-08 | 0.75 | 0.91 | 1.12 | 1.71 |
| 2018-03-09 | 0.75 | 0.9 | 1.12 | 1.68 |
| 2018-03-12 | 0.75 | 0.9 | 1.12 | 1.67 |
| 2018-03-13 | 0.75 | 0.9 | 1.12 | 1.67 |
| 2018-03-14 | 0.75 | 0.9 | 1.12 | 1.67 |
| 2018-03-15 | 0.75 | 0.9 | 1.12 | 1.7 |
| 2018-03-16 | 0.75 | 0.9 | 1.12 | 1.7 |
| 2018-03-19 | 0.75 | 0.9 | 1.12 | 1.71 |
| 2018-03-20 | 0.75 | 0.9 | 1.12 | 1.72 |
| 2018-03-21 | 0.75 | 0.9 | 1.12 | 1.76 |
| 2018-03-22 | 0.75 | 0.9 | 1.12 | 1.75 |
| 2018-03-23 | 0.75 | 0.9 | 1.12 | 1.73 |
| 2018-03-26 | 0.75 | 0.9 | 1.12 | 1.71 |
| 2018-03-27 | 0.75 | 0.9 | 1.12 | 1.69 |
| 2018-03-28 | 0.75 | 0.9 | 1.12 | 1.64 |
| 2018-03-29 | 0.75 | 0.9 | 1.12 | 1.65 |
| 2018-04-03 | 0.75 | 0.9 | 1.12 | 1.66 |
| 2018-04-04 | 0.75 | 0.9 | 1.12 | 1.66 |
| 2018-04-05 | 0.75 | 0.9 | 1.12 | 1.68 |
| 2018-04-06 | 0.75 | 0.9 | 1.12 | 1.66 |
| 2018-04-09 | 0.75 | 0.9 | 1.12 | 1.65 |
| 2018-04-10 | 0.75 | 0.9 | 1.12 | 1.65 |
| 2018-04-11 | 0.75 | 0.9 | 1.12 | 1.63 |
| 2018-04-12 | 0.75 | 0.9 | 1.12 | 1.62 |
| 2018-04-13 | 0.75 | 0.9 | 1.12 | 1.64 |
| 2018-04-16 | 0.75 | 0.9 | 1.12 | 1.64 |
| 2018-04-17 | 0.75 | 0.9 | 1.13 | 1.63 |
| 2018-04-18 | 0.75 | 0.9 | 1.12 | 1.61 |
| 2018-04-19 | 0.75 | 0.9 | 1.12 | 1.62 |
| 2018-04-20 | 0.75 | 0.9 | 1.12 | 1.63 |
| 2018-04-23 | 0.75 | 0.9 | 1.12 | 1.66 |
| 2018-04-24 | 0.75 | 0.9 | 1.12 | 1.65 |
| 2018-04-25 | 0.75 | 0.9 | 1.12 | 1.66 |
| 2018-04-26 | 0.75 | 0.9 | 1.12 | 1.66 |
| 2018-04-27 | 0.75 | 0.9 | 1.12 | 1.62 |
| 2018-04-30 | 0.75 | 0.9 | 1.12 | 1.62 |
| 2018-05-02 | 0.75 | 0.9 | 1.12 | 1.64 |
| 2018-05-03 | 0.75 | 0.9 | 1.12 | 1.67 |
| 2018-05-04 | 0.75 | 0.9 | 1.12 | 1.68 |
| 2018-05-07 | 0.75 | 0.9 | 1.12 | 1.68 |
| 2018-05-09 | 0.75 | 0.9 | 1.12 | 1.74 |
| 2018-05-10 | 0.75 | 0.9 | 1.12 | 1.76 |
| 2018-05-11 | 0.75 | 0.9 | 1.12 | 1.76 |
| 2018-05-14 | 0.75 | 0.9 | 1.12 | 1.8 |
| 2018-05-15 | 0.75 | 0.9 | 1.12 | 1.82 |
| 2018-05-16 | 0.75 | 0.9 | 1.12 | 1.84 |
| 2018-05-17 | 0.75 | 0.9 | 1.12 | 1.86 |
| 2018-05-18 | 0.75 | 0.9 | 1.12 | 1.84 |
| 2018-05-21 | 0.75 | 0.9 | 1.12 | 1.87 |
| 2018-05-22 | 0.75 | 0.9 | 1.12 | 1.89 |
| 2018-05-23 | 0.75 | 0.9 | 1.12 | 1.85 |
| 2018-05-24 | 0.75 | 0.9 | 1.12 | 1.82 |
| 2018-05-25 | 0.75 | 0.9 | 1.12 | 1.79 |
| 2018-05-28 | 0.75 | 0.9 | 1.12 | 1.76 |
| 2018-05-29 | 0.75 | 0.9 | 1.12 | 1.7 |
| 2018-05-30 | 0.75 | 0.9 | 1.12 | 1.68 |
| 2018-05-31 | 0.75 | 0.9 | 1.12 | 1.73 |
| 2018-06-01 | 0.75 | 0.9 | 1.12 | 1.72 |
| 2018-06-04 | 0.75 | 0.9 | 1.12 | 1.73 |
| 2018-06-05 | 0.75 | 0.9 | 1.12 | 1.76 |
| 2018-06-06 | 0.75 | 0.9 | 1.12 | 1.83 |
| 2018-06-07 | 0.75 | 0.9 | 1.12 | 1.86 |
| 2018-06-08 | 0.75 | 0.9 | 1.12 | 1.84 |
| 2018-06-11 | 0.75 | 0.92 | 1.13 | 1.93 |
| 2018-06-12 | 0.75 | 0.92 | 1.14 | 1.93 |
| 2018-06-13 | 0.75 | 0.92 | 1.14 | 1.91 |
| 2018-06-14 | 0.75 | 0.93 | 1.14 | 1.94 |
| 2018-06-15 | 0.75 | 0.92 | 1.14 | 1.94 |
| 2018-06-18 | 0.75 | 0.93 | 1.15 | 1.91 |
| 2018-06-19 | 0.75 | 0.93 | 1.15 | 1.87 |
| 2018-06-20 | 0.75 | 0.93 | 1.15 | 1.85 |
| 2018-06-21 | 0.75 | 0.93 | 1.15 | 1.85 |
| 2018-06-22 | 0.75 | 0.93 | 1.16 | 1.85 |
| 2018-06-25 | 0.75 | 0.93 | 1.16 | 1.8 |
| 2018-06-26 | 0.75 | 0.93 | 1.16 | 1.84 |
| 2018-06-27 | 0.75 | 0.93 | 1.16 | 1.82 |
| 2018-06-28 | 1 | 1.16 | 1.35 | 1.94 |
| 2018-06-29 | 1 | 1.16 | 1.35 | 1.94 |
| 2018-07-02 | 1 | 1.16 | 1.35 | 1.92 |
| 2018-07-03 | 1 | 1.16 | 1.35 | 1.97 |
| 2018-07-04 | 1 | 1.17 | 1.36 | 2 |
| 2018-07-09 | 1 | 1.17 | 1.37 | 1.92 |
| 2018-07-10 | 1 | 1.17 | 1.37 | 1.94 |
| 2018-07-11 | 1 | 1.18 | 1.38 | 2.02 |
| 2018-07-12 | 1 | 1.18 | 1.38 | 2.02 |
| 2018-07-13 | 1 | 1.18 | 1.39 | 2.05 |
| 2018-07-16 | 1 | 1.18 | 1.39 | 2.03 |
| 2018-07-17 | 1 | 1.19 | 1.4 | 2.03 |
| 2018-07-18 | 1 | 1.18 | 1.39 | 2.01 |
| 2018-07-19 | 1 | 1.19 | 1.39 | 2.02 |
| 2018-07-20 | 1 | 1.18 | 1.39 | 2.01 |
| 2018-07-23 | 1 | 1.19 | 1.39 | 2.03 |
| 2018-07-24 | 1 | 1.19 | 1.4 | 2.08 |
| 2018-07-25 | 1 | 1.2 | 1.41 | 2.09 |
| 2018-07-26 | 1 | 1.2 | 1.41 | 2.12 |
| 2018-07-27 | 1 | 1.2 | 1.41 | 2.15 |
| 2018-07-30 | 1 | 1.21 | 1.43 | 2.15 |
| 2018-07-31 | 1 | 1.22 | 1.43 | 2.17 |
| 2018-08-01 | 1 | 1.23 | 1.45 | 2.18 |
| 2018-08-02 | 1 | 1.24 | 1.45 | 2.17 |
| 2018-08-03 | 1.25 | 1.42 | 1.61 | 2.21 |
| 2018-08-06 | 1.25 | 1.44 | 1.64 | 2.19 |
| 2018-08-07 | 1.25 | 1.45 | 1.65 | 2.19 |
| 2018-08-08 | 1.25 | 1.45 | 1.66 | 2.19 |
| 2018-08-09 | 1.25 | 1.46 | 1.67 | 2.17 |
| 2018-08-10 | 1.25 | 1.46 | 1.67 | 2.18 |
| 2018-08-13 | 1.25 | 1.46 | 1.68 | 2.15 |
| 2018-08-14 | 1.25 | 1.46 | 1.68 | 2.13 |
| 2018-08-15 | 1.25 | 1.46 | 1.68 | 2.16 |
| 2018-08-16 | 1.25 | 1.46 | 1.68 | 2.17 |
| 2018-08-17 | 1.25 | 1.47 | 1.68 | 2.18 |
| 2018-08-20 | 1.25 | 1.47 | 1.69 | 2.2 |
| 2018-08-21 | 1.25 | 1.48 | 1.7 | 2.22 |
| 2018-08-22 | 1.25 | 1.48 | 1.71 | 2.22 |
| 2018-08-23 | 1.25 | 1.48 | 1.71 | 2.23 |
| 2018-08-24 | 1.25 | 1.48 | 1.71 | 2.24 |
| 2018-08-27 | 1.25 | 1.49 | 1.71 | 2.24 |
| 2018-08-28 | 1.25 | 1.49 | 1.72 | 2.24 |
| 2018-08-29 | 1.25 | 1.49 | 1.72 | 2.24 |
| 2018-08-30 | 1.25 | 1.49 | 1.73 | 2.24 |
| 2018-08-31 | 1.25 | 1.5 | 1.73 | 2.23 |
| 2018-09-03 | 1.25 | 1.5 | 1.73 | 2.23 |
| 2018-09-04 | 1.25 | 1.5 | 1.74 | 2.25 |
| 2018-09-05 | 1.25 | 1.51 | 1.74 | 2.29 |
| 2018-09-06 | 1.25 | 1.51 | 1.75 | 2.3 |
| 2018-09-07 | 1.25 | 1.51 | 1.74 | 2.3 |
| 2018-09-10 | 1.25 | 1.51 | 1.75 | 2.3 |
| 2018-09-11 | 1.25 | 1.52 | 1.77 | 2.37 |
| 2018-09-12 | 1.25 | 1.53 | 1.78 | 2.4 |
| 2018-09-13 | 1.25 | 1.54 | 1.78 | 2.39 |
| 2018-09-14 | 1.25 | 1.54 | 1.79 | 2.39 |
| 2018-09-17 | 1.25 | 1.54 | 1.79 | 2.39 |
| 2018-09-18 | 1.25 | 1.55 | 1.8 | 2.39 |
| 2018-09-19 | 1.25 | 1.56 | 1.81 | 2.42 |
| 2018-09-20 | 1.25 | 1.56 | 1.81 | 2.44 |
| 2018-09-21 | 1.25 | 1.56 | 1.82 | 2.43 |
| 2018-09-24 | 1.25 | 1.56 | 1.82 | 2.43 |
| 2018-09-25 | 1.25 | 1.57 | 1.82 | 2.46 |
| 2018-09-26 | 1.25 | 1.58 | 1.83 | 2.46 |
| 2018-09-27 | 1.5 | 1.7 | 1.89 | 2.43 |
| 2018-10-01 | 1.5 | 1.72 | 1.9 | 2.43 |
| 2018-10-02 | 1.5 | 1.73 | 1.91 | 2.43 |
| 2018-10-03 | 1.5 | 1.73 | 1.92 | 2.5 |
| 2018-10-04 | 1.5 | 1.74 | 1.93 | 2.57 |
| 2018-10-05 | 1.5 | 1.74 | 1.93 | 2.56 |
| 2018-10-08 | 1.5 | 1.74 | 1.93 | 2.56 |
| 2018-10-09 | 1.5 | 1.75 | 1.93 | 2.6 |
| 2018-10-10 | 1.5 | 1.75 | 1.94 | 2.61 |
| 2018-10-11 | 1.5 | 1.75 | 1.95 | 2.61 |
| 2018-10-12 | 1.5 | 1.75 | 1.96 | 2.63 |
| 2018-10-15 | 1.5 | 1.76 | 1.96 | 2.64 |
| 2018-10-16 | 1.5 | 1.76 | 1.97 | 2.66 |
| 2018-10-17 | 1.5 | 1.76 | 1.97 | 2.65 |
| 2018-10-18 | 1.5 | 1.76 | 1.97 | 2.66 |
| 2018-10-19 | 1.5 | 1.77 | 1.97 | 2.64 |
| 2018-10-22 | 1.5 | 1.77 | 1.97 | 2.67 |
| 2018-10-23 | 1.5 | 1.77 | 1.98 | 2.64 |
| 2018-10-24 | 1.5 | 1.78 | 1.98 | 2.57 |
| 2018-10-25 | 1.5 | 1.78 | 1.97 | 2.56 |
| 2018-10-26 | 1.5 | 1.79 | 1.98 | 2.56 |
| 2018-10-29 | 1.5 | 1.8 | 1.99 | 2.55 |
| 2018-10-30 | 1.5 | 1.8 | 1.99 | 2.56 |
| 2018-10-31 | 1.5 | 1.81 | 2 | 2.58 |
| 2018-11-01 | 1.5 | 1.82 | 2.01 | 2.6 |
| 2018-11-02 | 1.75 | 1.96 | 2.14 | 2.58 |
| 2018-11-05 | 1.75 | 1.97 | 2.14 | 2.57 |
| 2018-11-06 | 1.75 | 1.97 | 2.15 | 2.52 |
| 2018-11-07 | 1.75 | 1.97 | 2.16 | 2.56 |
| 2018-11-08 | 1.75 | 1.98 | 2.17 | 2.6 |
| 2018-11-09 | 1.75 | 1.99 | 2.18 | 2.6 |
| 2018-11-12 | 1.75 | 1.99 | 2.18 | 2.6 |
| 2018-11-13 | 1.75 | 1.99 | 2.18 | 2.62 |
| 2018-11-14 | 1.75 | 1.99 | 2.19 | 2.58 |
| 2018-11-15 | 1.75 | 2 | 2.2 | 2.56 |
| 2018-11-16 | 1.75 | 2 | 2.2 | 2.56 |
| 2018-11-19 | 1.75 | 2 | 2.2 | 2.55 |
| 2018-11-20 | 1.75 | 2.01 | 2.21 | 2.53 |
| 2018-11-21 | 1.75 | 2.01 | 2.21 | 2.51 |
| 2018-11-22 | 1.75 | 2.01 | 2.21 | 2.48 |
| 2018-11-23 | 1.75 | 2.02 | 2.22 | 2.49 |
| 2018-11-26 | 1.75 | 2.02 | 2.22 | 2.46 |
| 2018-11-27 | 1.75 | 2.02 | 2.22 | 2.4 |
| 2018-11-28 | 1.75 | 2.02 | 2.22 | 2.4 |
| 2018-11-29 | 1.75 | 2.02 | 2.22 | 2.42 |
| 2018-11-30 | 1.75 | 2.02 | 2.22 | 2.41 |
| 2018-12-03 | 1.75 | 2.01 | 2.21 | 2.47 |
| 2018-12-04 | 1.75 | 2.01 | 2.21 | 2.4 |
| 2018-12-05 | 1.75 | 2.01 | 2.21 | 2.37 |
| 2018-12-06 | 1.75 | 2.01 | 2.21 | 2.37 |
| 2018-12-07 | 1.75 | 2.01 | 2.21 | 2.36 |
| 2018-12-10 | 1.75 | 2.01 | 2.21 | 2.34 |
| 2018-12-11 | 1.75 | 2.01 | 2.21 | 2.32 |
| 2018-12-12 | 1.75 | 2.01 | 2.21 | 2.34 |
| 2018-12-13 | 1.75 | 2.02 | 2.21 | 2.36 |
| 2018-12-14 | 1.75 | 2.02 | 2.21 | 2.35 |
| 2018-12-17 | 1.75 | 2.02 | 2.21 | 2.33 |
| 2018-12-18 | 1.75 | 2.02 | 2.21 | 2.3 |
| 2018-12-19 | 1.75 | 2.02 | 2.21 | 2.29 |
| 2018-12-20 | 1.75 | 2.02 | 2.21 | 2.11 |
| 2018-12-21 | 1.75 | 2.02 | 2.21 | 2.06 |
| 2018-12-27 | 1.75 | 2.01 | 2.2 | 1.99 |
| 2018-12-28 | 1.75 | 2.02 | 2.21 | 1.86 |
| 2018-12-31 | 1.75 | 2.01 | 2.21 | 1.85 |
| 2019-01-02 | 1.75 | 2.01 | 2.2 | 1.75 |
| 2019-01-03 | 1.75 | 2.01 | 2.2 | 1.74 |
| 2019-01-04 | 1.75 | 2.01 | 2.21 | 1.83 |
| 2019-01-07 | 1.75 | 2.01 | 2.21 | 1.88 |
| 2019-01-08 | 1.75 | 2.01 | 2.21 | 1.9 |
| 2019-01-09 | 1.75 | 2.01 | 2.21 | 2 |
| 2019-01-10 | 1.75 | 2.01 | 2.21 | 1.97 |
| 2019-01-11 | 1.75 | 2.01 | 2.21 | 1.94 |
| 2019-01-14 | 1.75 | 2.01 | 2.21 | 1.88 |
| 2019-01-15 | 1.75 | 2.01 | 2.21 | 1.77 |
| 2019-01-16 | 1.75 | 2.01 | 2.21 | 1.88 |
| 2019-01-17 | 1.75 | 2.01 | 2.21 | 1.94 |
| 2019-01-18 | 1.75 | 2.01 | 2.22 | 2.01 |
| 2019-01-21 | 1.75 | 2.01 | 2.22 | 1.99 |
| 2019-01-22 | 1.75 | 2.01 | 2.22 | 1.99 |
| 2019-01-23 | 1.75 | 2.01 | 2.22 | 1.96 |
| 2019-01-24 | 1.75 | 2 | 2.22 | 1.97 |
| 2019-01-25 | 1.75 | 2 | 2.22 | 1.93 |
| 2019-01-28 | 1.75 | 2 | 2.22 | 1.93 |
| 2019-01-29 | 1.75 | 1.99 | 2.22 | 1.96 |
| 2019-01-30 | 1.75 | 1.99 | 2.21 | 1.93 |
| 2019-01-31 | 1.75 | 1.99 | 2.21 | 1.86 |
| 2019-02-01 | 1.75 | 1.99 | 2.21 | 1.86 |
| 2019-02-04 | 1.75 | 1.99 | 2.2 | 1.84 |
| 2019-02-05 | 1.75 | 1.99 | 2.2 | 1.83 |
| 2019-02-06 | 1.75 | 1.99 | 2.2 | 1.82 |
| 2019-02-07 | 1.75 | 1.99 | 2.2 | 1.79 |
| 2019-02-08 | 1.75 | 1.99 | 2.2 | 1.78 |
| 2019-02-11 | 1.75 | 1.99 | 2.2 | 1.76 |
| 2019-02-12 | 1.75 | 1.99 | 2.2 | 1.78 |
| 2019-02-13 | 1.75 | 2 | 2.19 | 1.83 |
| 2019-02-14 | 1.75 | 2 | 2.19 | 1.9 |
| 2019-02-15 | 1.75 | 2.01 | 2.19 | 1.93 |
| 2019-02-18 | 1.75 | 2.02 | 2.19 | 1.97 |
| 2019-02-19 | 1.75 | 2.02 | 2.19 | 1.98 |
| 2019-02-20 | 1.75 | 2.02 | 2.19 | 1.92 |
| 2019-02-21 | 1.75 | 2.02 | 2.19 | 1.95 |
| 2019-02-22 | 1.75 | 2.02 | 2.19 | 1.98 |
| 2019-02-25 | 1.75 | 2.02 | 2.2 | 1.99 |
| 2019-02-26 | 1.75 | 2.02 | 2.2 | 2 |
| 2019-02-27 | 1.75 | 2.02 | 2.2 | 2.02 |
| 2019-02-28 | 1.75 | 2.02 | 2.2 | 2.06 |
| 2019-03-01 | 1.75 | 2.03 | 2.2 | 2.07 |
| 2019-03-04 | 1.75 | 2.03 | 2.2 | 2.1 |
| 2019-03-05 | 1.75 | 2.03 | 2.2 | 2.1 |
| 2019-03-06 | 1.75 | 2.03 | 2.2 | 2.07 |
| 2019-03-07 | 1.75 | 2.03 | 2.21 | 2.06 |
| 2019-03-08 | 1.75 | 2.03 | 2.2 | 1.99 |
| 2019-03-11 | 1.75 | 2.03 | 2.2 | 1.99 |
| 2019-03-12 | 1.75 | 2.03 | 2.2 | 1.99 |
| 2019-03-13 | 1.75 | 2.03 | 2.2 | 1.96 |
| 2019-03-14 | 1.75 | 2.03 | 2.2 | 1.98 |
| 2019-03-15 | 1.75 | 2.03 | 2.2 | 2.02 |
| 2019-03-18 | 1.75 | 2.03 | 2.2 | 2.04 |
| 2019-03-19 | 1.75 | 2.03 | 2.2 | 2.05 |
| 2019-03-20 | 1.75 | 2.03 | 2.2 | 2.06 |
| 2019-03-21 | 1.75 | 2.03 | 2.2 | 1.98 |
| 2019-03-22 | 1.75 | 2.03 | 2.2 | 1.93 |
| 2019-03-25 | 1.75 | 2.02 | 2.2 | 1.87 |
| 2019-03-26 | 1.75 | 2.02 | 2.2 | 1.87 |
| 2019-03-27 | 1.75 | 2.02 | 2.2 | 1.86 |
| 2019-03-28 | 1.75 | 2.02 | 2.2 | 1.8 |
| 2019-03-29 | 1.75 | 2.02 | 2.2 | 1.83 |
| 2019-04-01 | 1.75 | 2.02 | 2.2 | 1.84 |
| 2019-04-02 | 1.75 | 2.02 | 2.2 | 1.87 |
| 2019-04-03 | 1.75 | 2.02 | 2.2 | 1.93 |
| 2019-04-04 | 1.75 | 2.02 | 2.2 | 1.94 |
| 2019-04-05 | 1.75 | 2.02 | 2.2 | 1.99 |
| 2019-04-08 | 1.75 | 2.02 | 2.2 | 1.98 |
| 2019-04-09 | 1.75 | 2.02 | 2.2 | 1.97 |
| 2019-04-10 | 1.75 | 2.02 | 2.2 | 1.97 |
| 2019-04-11 | 1.75 | 2.02 | 2.2 | 1.93 |
| 2019-04-12 | 1.75 | 2.02 | 2.21 | 1.95 |
| 2019-04-15 | 1.75 | 2.02 | 2.21 | 1.97 |
| 2019-04-16 | 1.75 | 2.02 | 2.21 | 1.96 |
| 2019-04-17 | 1.75 | 2.02 | 2.21 | 1.98 |
| 2019-04-18 | 1.75 | 2.02 | 2.21 | 1.98 |
| 2019-04-23 | 1.75 | 2.02 | 2.22 | 1.96 |
| 2019-04-24 | 1.75 | 2.02 | 2.22 | 1.99 |
| 2019-04-25 | 1.75 | 2.02 | 2.22 | 2 |
| 2019-04-26 | 1.75 | 2.03 | 2.23 | 2.06 |
| 2019-04-29 | 1.75 | 2.04 | 2.23 | 2.06 |
| 2019-04-30 | 1.75 | 2.05 | 2.23 | 2.13 |
| 2019-05-02 | 1.75 | 2.05 | 2.23 | 2.13 |
| 2019-05-03 | 2 | 2.2 | 2.34 | 2.12 |
| 2019-05-06 | 2 | 2.21 | 2.34 | 2.09 |
| 2019-05-07 | 2 | 2.21 | 2.34 | 2.08 |
| 2019-05-09 | 2 | 2.21 | 2.34 | 2.06 |
| 2019-05-10 | 2 | 2.2 | 2.34 | 2.08 |
| 2019-05-13 | 2 | 2.2 | 2.33 | 2.05 |
| 2019-05-14 | 2 | 2.2 | 2.33 | 2.02 |
| 2019-05-15 | 2 | 2.2 | 2.32 | 1.95 |
| 2019-05-16 | 2 | 2.2 | 2.32 | 1.95 |
| 2019-05-17 | 2 | 2.2 | 2.32 | 1.96 |
| 2019-05-20 | 2 | 2.2 | 2.32 | 1.97 |
| 2019-05-21 | 2 | 2.2 | 2.32 | 1.96 |
| 2019-05-22 | 2 | 2.2 | 2.32 | 1.92 |
| 2019-05-23 | 2 | 2.19 | 2.31 | 1.88 |
| 2019-05-24 | 2 | 2.19 | 2.31 | 1.88 |
| 2019-05-27 | 2 | 2.19 | 2.31 | 1.9 |
| 2019-05-28 | 2 | 2.19 | 2.31 | 1.88 |
| 2019-05-29 | 2 | 2.19 | 2.31 | 1.87 |
| 2019-05-30 | 2 | 2.19 | 2.31 | 1.86 |
| 2019-05-31 | 2 | 2.19 | 2.31 | 1.79 |
| 2019-06-03 | 2 | 2.19 | 2.31 | 1.77 |
| 2019-06-04 | 2 | 2.18 | 2.3 | 1.78 |
| 2019-06-05 | 2 | 2.18 | 2.3 | 1.82 |
| 2019-06-06 | 2 | 2.18 | 2.3 | 1.79 |
| 2019-06-07 | 2 | 2.18 | 2.3 | 1.8 |
| 2019-06-10 | 2 | 2.17 | 2.29 | 1.79 |
| 2019-06-11 | 2 | 2.17 | 2.29 | 1.81 |
| 2019-06-12 | 2 | 2.17 | 2.29 | 1.77 |
| 2019-06-13 | 2 | 2.17 | 2.29 | 1.73 |
| 2019-06-14 | 2 | 2.17 | 2.29 | 1.68 |
| 2019-06-17 | 2 | 2.17 | 2.29 | 1.7 |
| 2019-06-18 | 2 | 2.17 | 2.29 | 1.66 |
| 2019-06-19 | 2 | 2.17 | 2.29 | 1.66 |
| 2019-06-20 | 2 | 2.17 | 2.29 | 1.65 |
| 2019-06-21 | 2 | 2.17 | 2.29 | 1.67 |
| 2019-06-24 | 2 | 2.17 | 2.29 | 1.68 |
| 2019-06-25 | 2 | 2.17 | 2.29 | 1.68 |
| 2019-06-26 | 2 | 2.17 | 2.29 | 1.69 |
| 2019-06-27 | 2 | 2.17 | 2.29 | 1.72 |
| 2019-06-28 | 2 | 2.17 | 2.29 | 1.69 |
| 2019-07-01 | 2 | 2.17 | 2.29 | 1.68 |
| 2019-07-02 | 2 | 2.17 | 2.29 | 1.67 |
| 2019-07-03 | 2 | 2.17 | 2.29 | 1.59 |
| 2019-07-04 | 2 | 2.17 | 2.29 | 1.59 |
| 2019-07-08 | 2 | 2.17 | 2.29 | 1.63 |
| 2019-07-09 | 2 | 2.17 | 2.28 | 1.6 |
| 2019-07-10 | 2 | 2.17 | 2.28 | 1.63 |
| 2019-07-11 | 2 | 2.17 | 2.28 | 1.62 |
| 2019-07-12 | 2 | 2.17 | 2.28 | 1.72 |
| 2019-07-15 | 2 | 2.16 | 2.28 | 1.7 |
| 2019-07-16 | 2 | 2.16 | 2.28 | 1.7 |
| 2019-07-17 | 2 | 2.16 | 2.28 | 1.7 |
| 2019-07-18 | 2 | 2.16 | 2.28 | 1.7 |
| 2019-07-19 | 2 | 2.16 | 2.28 | 1.7 |
| 2019-07-22 | 2 | 2.16 | 2.28 | 1.7 |
| 2019-07-23 | 2 | 2.16 | 2.28 | 1.69 |
| 2019-07-24 | 2 | 2.16 | 2.28 | 1.59 |
| 2019-07-25 | 2 | 2.16 | 2.28 | 1.56 |
| 2019-07-26 | 2 | 2.16 | 2.27 | 1.6 |
| 2019-07-29 | 2 | 2.16 | 2.27 | 1.6 |
| 2019-07-30 | 2 | 2.16 | 2.27 | 1.61 |
| 2019-07-31 | 2 | 2.16 | 2.27 | 1.62 |
| 2019-08-01 | 2 | 2.16 | 2.27 | 1.62 |
| 2019-08-02 | 2 | 2.16 | 2.26 | 1.54 |
| 2019-08-05 | 2 | 2.15 | 2.25 | 1.44 |
| 2019-08-06 | 2 | 2.15 | 2.25 | 1.44 |
| 2019-08-07 | 2 | 2.15 | 2.24 | 1.41 |
| 2019-08-08 | 2 | 2.14 | 2.24 | 1.32 |
| 2019-08-09 | 2 | 2.14 | 2.23 | 1.29 |
| 2019-08-12 | 2 | 2.14 | 2.23 | 1.33 |
| 2019-08-13 | 2 | 2.14 | 2.22 | 1.27 |
| 2019-08-14 | 2 | 2.14 | 2.21 | 1.23 |
| 2019-08-15 | 2 | 2.14 | 2.21 | 1.19 |
| 2019-08-16 | 2 | 2.14 | 2.2 | 1.21 |
| 2019-08-19 | 2 | 2.14 | 2.21 | 1.25 |
| 2019-08-20 | 2 | 2.14 | 2.21 | 1.25 |
| 2019-08-21 | 2 | 2.14 | 2.21 | 1.27 |
| 2019-08-22 | 2 | 2.14 | 2.2 | 1.3 |
| 2019-08-23 | 2 | 2.14 | 2.2 | 1.37 |
| 2019-08-26 | 2 | 2.14 | 2.2 | 1.32 |
| 2019-08-27 | 2 | 2.14 | 2.2 | 1.27 |
| 2019-08-28 | 2 | 2.14 | 2.2 | 1.2 |
| 2019-08-29 | 2 | 2.14 | 2.2 | 1.25 |
| 2019-08-30 | 2 | 2.14 | 2.2 | 1.3 |
| 2019-09-02 | 2 | 2.14 | 2.2 | 1.3 |
| 2019-09-03 | 2 | 2.14 | 2.2 | 1.28 |
| 2019-09-04 | 2 | 2.14 | 2.2 | 1.32 |
| 2019-09-05 | 2 | 2.14 | 2.2 | 1.39 |
| 2019-09-06 | 2 | 2.14 | 2.2 | 1.48 |
| 2019-09-09 | 2 | 2.14 | 2.2 | 1.51 |
| 2019-09-10 | 2 | 2.14 | 2.2 | 1.56 |
| 2019-09-11 | 2 | 2.14 | 2.2 | 1.62 |
| 2019-09-12 | 2 | 2.14 | 2.2 | 1.55 |
| 2019-09-13 | 2 | 2.14 | 2.2 | 1.63 |
| 2019-09-16 | 2 | 2.14 | 2.2 | 1.66 |
| 2019-09-17 | 2 | 2.14 | 2.2 | 1.67 |
| 2019-09-18 | 2 | 2.14 | 2.2 | 1.62 |
| 2019-09-19 | 2 | 2.14 | 2.2 | 1.6 |
| 2019-09-20 | 2 | 2.14 | 2.2 | 1.61 |
| 2019-09-23 | 2 | 2.14 | 2.2 | 1.58 |
| 2019-09-24 | 2 | 2.14 | 2.2 | 1.56 |
| 2019-09-25 | 2 | 2.14 | 2.2 | 1.53 |
| 2019-09-26 | 2 | 2.15 | 2.22 | 1.67 |
| 2019-09-27 | 2 | 2.16 | 2.23 | 1.65 |
| 2019-09-30 | 2 | 2.16 | 2.24 | 1.7 |
| 2019-10-01 | 2 | 2.16 | 2.25 | 1.78 |
| 2019-10-02 | 2 | 2.16 | 2.26 | 1.71 |
| 2019-10-03 | 2 | 2.17 | 2.26 | 1.59 |
| 2019-10-04 | 2 | 2.17 | 2.25 | 1.55 |
| 2019-10-07 | 2 | 2.17 | 2.26 | 1.57 |
| 2019-10-08 | 2 | 2.17 | 2.27 | 1.54 |
| 2019-10-09 | 2 | 2.17 | 2.27 | 1.55 |
| 2019-10-10 | 2 | 2.17 | 2.27 | 1.54 |
| 2019-10-11 | 2 | 2.17 | 2.27 | 1.64 |
| 2019-10-14 | 2 | 2.17 | 2.28 | 1.7 |
| 2019-10-15 | 2 | 2.17 | 2.28 | 1.72 |
| 2019-10-16 | 2 | 2.18 | 2.29 | 1.79 |
| 2019-10-17 | 2 | 2.18 | 2.29 | 1.84 |
| 2019-10-18 | 2 | 2.18 | 2.29 | 1.85 |
| 2019-10-21 | 2 | 2.18 | 2.29 | 1.78 |
| 2019-10-22 | 2 | 2.18 | 2.29 | 1.74 |
| 2019-10-23 | 2 | 2.18 | 2.29 | 1.76 |
| 2019-10-24 | 2 | 2.18 | 2.28 | 1.73 |
| 2019-10-25 | 2 | 2.18 | 2.28 | 1.74 |
| 2019-10-29 | 2 | 2.18 | 2.28 | 1.77 |
| 2019-10-30 | 2 | 2.18 | 2.28 | 1.78 |
| 2019-10-31 | 2 | 2.18 | 2.28 | 1.75 |
| 2019-11-01 | 2 | 2.17 | 2.27 | 1.74 |
| 2019-11-04 | 2 | 2.18 | 2.28 | 1.79 |
| 2019-11-05 | 2 | 2.18 | 2.28 | 1.82 |
| 2019-11-06 | 2 | 2.18 | 2.28 | 1.83 |
| 2019-11-07 | 2 | 2.18 | 2.28 | 1.85 |
| 2019-11-08 | 2 | 2.19 | 2.29 | 1.97 |
| 2019-11-11 | 2 | 2.18 | 2.29 | 1.99 |
| 2019-11-12 | 2 | 2.18 | 2.29 | 1.97 |
| 2019-11-13 | 2 | 2.18 | 2.29 | 1.92 |
| 2019-11-14 | 2 | 2.17 | 2.28 | 1.85 |
| 2019-11-15 | 2 | 2.17 | 2.28 | 1.83 |
| 2019-11-18 | 2 | 2.18 | 2.29 | 1.85 |
| 2019-11-19 | 2 | 2.18 | 2.29 | 1.87 |
| 2019-11-20 | 2 | 2.18 | 2.28 | 1.85 |
| 2019-11-21 | 2 | 2.18 | 2.28 | 1.86 |
| 2019-11-22 | 2 | 2.18 | 2.28 | 1.87 |
| 2019-11-25 | 2 | 2.18 | 2.28 | 1.87 |
| 2019-11-26 | 2 | 2.18 | 2.28 | 1.84 |
| 2019-11-27 | 2 | 2.18 | 2.28 | 1.81 |
| 2019-11-28 | 2 | 2.18 | 2.28 | 1.81 |
| 2019-11-29 | 2 | 2.18 | 2.28 | 1.83 |
| 2019-12-02 | 2 | 2.18 | 2.28 | 1.89 |
| 2019-12-03 | 2 | 2.18 | 2.27 | 1.88 |
| 2019-12-04 | 2 | 2.18 | 2.26 | 1.87 |
| 2019-12-05 | 2 | 2.18 | 2.26 | 1.9 |
| 2019-12-06 | 2 | 2.18 | 2.26 | 1.91 |
| 2019-12-09 | 2 | 2.18 | 2.26 | 1.91 |
| 2019-12-10 | 2 | 2.18 | 2.26 | 1.93 |
| 2019-12-11 | 2 | 2.18 | 2.26 | 1.89 |
| 2019-12-12 | 2 | 2.18 | 2.26 | 1.88 |
| 2019-12-13 | 2 | 2.18 | 2.27 | 1.96 |
| 2019-12-16 | 2 | 2.18 | 2.27 | 1.93 |
| 2019-12-17 | 2 | 2.18 | 2.27 | 1.95 |
| 2019-12-18 | 2 | 2.18 | 2.27 | 1.95 |
| 2019-12-19 | 2 | 2.18 | 2.27 | 2.05 |
| 2019-12-20 | 2 | 2.18 | 2.27 | 2.03 |
| 2019-12-23 | 2 | 2.18 | 2.27 | 2.01 |
| 2019-12-27 | 2 | 2.18 | 2.27 | 2.02 |
| 2019-12-30 | 2 | 2.18 | 2.27 | 2.05 |
| 2019-12-31 | 2 | 2.18 | 2.27 | 2.07 |
| 2020-01-02 | 2 | 2.18 | 2.27 | 2.11 |
| 2020-01-03 | 2 | 2.17 | 2.27 | 2.03 |
| 2020-01-06 | 2 | 2.17 | 2.27 | 2.02 |
| 2020-01-07 | 2 | 2.17 | 2.27 | 2.04 |
| 2020-01-08 | 2 | 2.17 | 2.27 | 2.05 |
| 2020-01-09 | 2 | 2.17 | 2.27 | 2.07 |
| 2020-01-10 | 2 | 2.17 | 2.27 | 2.06 |
| 2020-01-13 | 2 | 2.17 | 2.27 | 2.13 |
| 2020-01-14 | 2 | 2.17 | 2.28 | 2.15 |
| 2020-01-15 | 2 | 2.17 | 2.28 | 2.08 |
| 2020-01-16 | 2 | 2.17 | 2.28 | 2.11 |
| 2020-01-17 | 2 | 2.17 | 2.28 | 2.05 |
| 2020-01-20 | 2 | 2.17 | 2.28 | 2.09 |
| 2020-01-21 | 2 | 2.17 | 2.28 | 2.08 |
| 2020-01-22 | 2 | 2.17 | 2.28 | 2.04 |
| 2020-01-23 | 2 | 2.17 | 2.28 | 1.9 |
| 2020-01-24 | 2 | 2.17 | 2.28 | 1.88 |
| 2020-01-27 | 2 | 2.17 | 2.27 | 1.84 |
| 2020-01-28 | 2 | 2.17 | 2.27 | 1.82 |
| 2020-01-29 | 2 | 2.17 | 2.27 | 1.9 |
| 2020-01-30 | 2 | 2.16 | 2.27 | 1.81 |
| 2020-01-31 | 2 | 2.16 | 2.27 | 1.82 |
| 2020-02-03 | 2 | 2.16 | 2.27 | 1.8 |
| 2020-02-04 | 2 | 2.16 | 2.27 | 1.86 |
| 2020-02-05 | 2 | 2.16 | 2.27 | 1.9 |
| 2020-02-06 | 2 | 2.16 | 2.27 | 1.89 |
| 2020-02-07 | 2.25 | 2.39 | 2.48 | 1.91 |
| 2020-02-10 | 2.25 | 2.39 | 2.47 | 1.91 |
| 2020-02-11 | 2.25 | 2.39 | 2.46 | 1.95 |
| 2020-02-12 | 2.25 | 2.39 | 2.45 | 2 |
| 2020-02-13 | 2.25 | 2.39 | 2.45 | 1.96 |
| 2020-02-14 | 2.25 | 2.39 | 2.45 | 1.99 |
| 2020-02-17 | 2.25 | 2.39 | 2.45 | 2 |
| 2020-02-18 | 2.25 | 2.39 | 2.45 | 1.98 |
| 2020-02-19 | 2.25 | 2.39 | 2.45 | 1.94 |
| 2020-02-20 | 2.25 | 2.39 | 2.45 | 1.91 |
| 2020-02-21 | 2.25 | 2.39 | 2.45 | 1.89 |
| 2020-02-24 | 2.25 | 2.39 | 2.45 | 1.84 |
| 2020-02-25 | 2.25 | 2.39 | 2.45 | 1.78 |
| 2020-02-26 | 2.25 | 2.39 | 2.45 | 1.74 |
| 2020-02-27 | 2.25 | 2.39 | 2.45 | 1.75 |
| 2020-02-28 | 2.25 | 2.38 | 2.43 | 1.55 |
| 2020-03-02 | 2.25 | 2.37 | 2.41 | 1.47 |
| 2020-03-03 | 2.25 | 2.35 | 2.38 | 1.52 |
| 2020-03-04 | 2.25 | 2.34 | 2.37 | 1.37 |
| 2020-03-05 | 2.25 | 2.34 | 2.37 | 1.45 |
| 2020-03-06 | 2.25 | 2.34 | 2.37 | 1.28 |
| 2020-03-09 | 2.25 | 2.34 | 2.36 | 1.02 |
| 2020-03-10 | 2.25 | 2.34 | 2.36 | 1.14 |
| 2020-03-11 | 2.25 | 2.33 | 2.36 | 1.08 |
| 2020-03-12 | 2.25 | 2.32 | 2.34 | 1.17 |
| 2020-03-13 | 2.25 | 2.31 | 2.34 | 1.34 |
| 2020-03-16 | 2.25 | 2.31 | 2.33 | 1.24 |
| 2020-03-17 | 1.75 | 1.83 | 1.85 | 1.07 |
| 2020-03-18 | 1.75 | 1.8 | 1.8 | 1.01 |
| 2020-03-19 | 1.75 | 1.79 | 1.77 | 0.87 |
| 2020-03-20 | 1.75 | 1.78 | 1.77 | 0.83 |
| 2020-03-23 | 1.75 | 1.76 | 1.75 | 0.73 |
| 2020-03-24 | 1.75 | 1.74 | 1.72 | 0.66 |
| 2020-03-25 | 1.75 | 1.72 | 1.71 | 0.79 |
| 2020-03-26 | 1.75 | 1.71 | 1.68 | 0.79 |
| 2020-03-27 | 1 | 1.08 | 1.11 | 0.71 |
| 2020-03-30 | 1 | 1.04 | 1.04 | 0.68 |
| 2020-03-31 | 1 | 1.03 | 1 | 0.75 |
| 2020-04-01 | 1 | 1.02 | 0.98 | 0.74 |
| 2020-04-02 | 1 | 1.02 | 0.98 | 0.81 |
| 2020-04-03 | 1 | 1.01 | 0.97 | 0.79 |
| 2020-04-06 | 1 | 1.01 | 0.97 | 0.78 |
| 2020-04-07 | 1 | 1.01 | 0.97 | 0.78 |
| 2020-04-08 | 1 | 1 | 0.97 | 0.79 |
| 2020-04-09 | 1 | 1 | 0.97 | 0.83 |
| 2020-04-14 | 1 | 0.98 | 0.94 | 0.81 |
| 2020-04-15 | 1 | 0.98 | 0.93 | 0.76 |
| 2020-04-16 | 1 | 0.97 | 0.92 | 0.75 |
| 2020-04-17 | 1 | 0.97 | 0.91 | 0.73 |
| 2020-04-20 | 1 | 0.97 | 0.91 | 0.7 |
| 2020-04-21 | 1 | 0.96 | 0.89 | 0.7 |
| 2020-04-22 | 1 | 0.95 | 0.88 | 0.71 |
| 2020-04-23 | 1 | 0.93 | 0.88 | 0.73 |
| 2020-04-24 | 1 | 0.91 | 0.87 | 0.72 |
| 2020-04-27 | 1 | 0.9 | 0.87 | 0.72 |
| 2020-04-28 | 1 | 0.9 | 0.87 | 0.75 |
| 2020-04-29 | 1 | 0.9 | 0.86 | 0.73 |
| 2020-04-30 | 1 | 0.9 | 0.86 | 0.69 |
| 2020-05-04 | 1 | 0.9 | 0.86 | 0.66 |
| 2020-05-05 | 1 | 0.9 | 0.85 | 0.64 |
| 2020-05-06 | 1 | 0.89 | 0.83 | 0.64 |
| 2020-05-07 | 1 | 0.87 | 0.82 | 0.64 |
| 2020-05-11 | 0.25 | 0.35 | 0.43 | 0.59 |
| 2020-05-12 | 0.25 | 0.35 | 0.42 | 0.56 |
| 2020-05-13 | 0.25 | 0.35 | 0.41 | 0.48 |
| 2020-05-14 | 0.25 | 0.35 | 0.41 | 0.48 |
| 2020-05-15 | 0.25 | 0.34 | 0.41 | 0.42 |
| 2020-05-18 | 0.25 | 0.34 | 0.41 | 0.42 |
| 2020-05-19 | 0.25 | 0.34 | 0.41 | 0.46 |
| 2020-05-20 | 0.25 | 0.34 | 0.41 | 0.49 |
| 2020-05-21 | 0.25 | 0.34 | 0.41 | 0.49 |
| 2020-05-22 | 0.25 | 0.34 | 0.42 | 0.49 |
| 2020-05-25 | 0.25 | 0.34 | 0.42 | 0.51 |
| 2020-05-26 | 0.25 | 0.33 | 0.42 | 0.51 |
| 2020-05-27 | 0.25 | 0.34 | 0.42 | 0.51 |
| 2020-05-28 | 0.25 | 0.34 | 0.43 | 0.51 |
| 2020-05-29 | 0.25 | 0.34 | 0.43 | 0.47 |
| 2020-06-01 | 0.25 | 0.34 | 0.43 | 0.45 |
| 2020-06-02 | 0.25 | 0.34 | 0.43 | 0.47 |
| 2020-06-03 | 0.25 | 0.34 | 0.43 | 0.49 |
| 2020-06-04 | 0.25 | 0.34 | 0.43 | 0.53 |
| 2020-06-05 | 0.25 | 0.34 | 0.43 | 0.6 |
| 2020-06-08 | 0.25 | 0.34 | 0.43 | 0.69 |
| 2020-06-09 | 0.25 | 0.34 | 0.43 | 0.66 |
| 2020-06-10 | 0.25 | 0.34 | 0.43 | 0.67 |
| 2020-06-11 | 0.25 | 0.34 | 0.43 | 0.62 |
| 2020-06-12 | 0.25 | 0.34 | 0.43 | 0.62 |
| 2020-06-15 | 0.25 | 0.34 | 0.43 | 0.61 |
| 2020-06-16 | 0.25 | 0.34 | 0.43 | 0.63 |
| 2020-06-17 | 0.25 | 0.34 | 0.43 | 0.66 |
| 2020-06-18 | 0.25 | 0.34 | 0.43 | 0.66 |
| 2020-06-19 | 0.25 | 0.34 | 0.43 | 0.65 |
| 2020-06-22 | 0.25 | 0.34 | 0.43 | 0.65 |
| 2020-06-23 | 0.25 | 0.34 | 0.43 | 0.66 |
| 2020-06-24 | 0.25 | 0.34 | 0.43 | 0.61 |
| 2020-06-25 | 0.25 | 0.34 | 0.43 | 0.59 |
| 2020-06-26 | 0.25 | 0.34 | 0.43 | 0.55 |
| 2020-06-29 | 0.25 | 0.34 | 0.43 | 0.54 |
| 2020-06-30 | 0.25 | 0.34 | 0.43 | 0.51 |
| 2020-07-01 | 0.25 | 0.34 | 0.43 | 0.5 |
| 2020-07-02 | 0.25 | 0.34 | 0.43 | 0.51 |
| 2020-07-03 | 0.25 | 0.34 | 0.43 | 0.51 |
| 2020-07-07 | 0.25 | 0.34 | 0.43 | 0.51 |
| 2020-07-08 | 0.25 | 0.34 | 0.43 | 0.51 |
| 2020-07-09 | 0.25 | 0.34 | 0.43 | 0.51 |
| 2020-07-10 | 0.25 | 0.34 | 0.43 | 0.51 |
| 2020-07-13 | 0.25 | 0.34 | 0.43 | 0.6 |
| 2020-07-14 | 0.25 | 0.34 | 0.43 | 0.59 |
| 2020-07-15 | 0.25 | 0.34 | 0.43 | 0.61 |
| 2020-07-16 | 0.25 | 0.34 | 0.43 | 0.65 |
| 2020-07-17 | 0.25 | 0.34 | 0.43 | 0.68 |
| 2020-07-20 | 0.25 | 0.34 | 0.43 | 0.67 |
| 2020-07-21 | 0.25 | 0.34 | 0.43 | 0.65 |
| 2020-07-22 | 0.25 | 0.34 | 0.43 | 0.65 |
| 2020-07-23 | 0.25 | 0.34 | 0.43 | 0.65 |
| 2020-07-24 | 0.25 | 0.34 | 0.43 | 0.66 |
| 2020-07-27 | 0.25 | 0.34 | 0.43 | 0.67 |
| 2020-07-28 | 0.25 | 0.34 | 0.43 | 0.67 |
| 2020-07-29 | 0.25 | 0.34 | 0.43 | 0.67 |
| 2020-07-30 | 0.25 | 0.34 | 0.43 | 0.67 |
| 2020-07-31 | 0.25 | 0.34 | 0.43 | 0.67 |
| 2020-08-03 | 0.25 | 0.34 | 0.43 | 0.67 |
| 2020-08-04 | 0.25 | 0.34 | 0.43 | 0.68 |
| 2020-08-05 | 0.25 | 0.34 | 0.43 | 0.67 |
| 2020-08-06 | 0.25 | 0.34 | 0.43 | 0.67 |
| 2020-08-07 | 0.25 | 0.34 | 0.43 | 0.67 |
| 2020-08-10 | 0.25 | 0.34 | 0.43 | 0.67 |
| 2020-08-11 | 0.25 | 0.34 | 0.43 | 0.7 |
| 2020-08-12 | 0.25 | 0.34 | 0.43 | 0.77 |
| 2020-08-13 | 0.25 | 0.34 | 0.43 | 0.76 |
| 2020-08-14 | 0.25 | 0.34 | 0.43 | 0.76 |
| 2020-08-17 | 0.25 | 0.34 | 0.43 | 0.77 |
| 2020-08-18 | 0.25 | 0.34 | 0.43 | 0.81 |
| 2020-08-19 | 0.25 | 0.34 | 0.43 | 0.8 |
| 2020-08-20 | 0.25 | 0.34 | 0.43 | 0.78 |
| 2020-08-21 | 0.25 | 0.34 | 0.43 | 0.78 |
| 2020-08-24 | 0.25 | 0.34 | 0.43 | 0.78 |
| 2020-08-25 | 0.25 | 0.34 | 0.43 | 0.8 |
| 2020-08-26 | 0.25 | 0.34 | 0.43 | 0.87 |
| 2020-08-27 | 0.25 | 0.34 | 0.43 | 0.86 |
| 2020-08-28 | 0.25 | 0.34 | 0.43 | 0.89 |
| 2020-08-31 | 0.25 | 0.34 | 0.43 | 0.92 |
| 2020-09-01 | 0.25 | 0.34 | 0.43 | 0.91 |
| 2020-09-02 | 0.25 | 0.34 | 0.43 | 0.9 |
| 2020-09-03 | 0.25 | 0.34 | 0.43 | 0.84 |
| 2020-09-04 | 0.25 | 0.34 | 0.43 | 0.83 |
| 2020-09-07 | 0.25 | 0.34 | 0.43 | 0.84 |
| 2020-09-08 | 0.25 | 0.34 | 0.43 | 0.84 |
| 2020-09-09 | 0.25 | 0.34 | 0.43 | 0.84 |
| 2020-09-10 | 0.25 | 0.34 | 0.43 | 0.81 |
| 2020-09-11 | 0.25 | 0.34 | 0.43 | 0.79 |
| 2020-09-14 | 0.25 | 0.34 | 0.44 | 0.77 |
| 2020-09-15 | 0.25 | 0.34 | 0.44 | 0.77 |
| 2020-09-16 | 0.25 | 0.34 | 0.44 | 0.69 |
| 2020-09-17 | 0.25 | 0.34 | 0.44 | 0.69 |
| 2020-09-18 | 0.25 | 0.34 | 0.44 | 0.69 |
| 2020-09-21 | 0.25 | 0.34 | 0.44 | 0.66 |
| 2020-09-22 | 0.25 | 0.34 | 0.44 | 0.55 |
| 2020-09-23 | 0.25 | 0.34 | 0.44 | 0.58 |
| 2020-09-24 | 0.25 | 0.34 | 0.44 | 0.61 |
| 2020-09-25 | 0.25 | 0.34 | 0.44 | 0.63 |
| 2020-09-29 | 0.25 | 0.35 | 0.44 | 0.62 |
| 2020-09-30 | 0.25 | 0.35 | 0.44 | 0.59 |
| 2020-10-01 | 0.25 | 0.35 | 0.44 | 0.61 |
| 2020-10-02 | 0.25 | 0.35 | 0.44 | 0.61 |
| 2020-10-05 | 0.25 | 0.35 | 0.44 | 0.61 |
| 2020-10-06 | 0.25 | 0.35 | 0.44 | 0.67 |
| 2020-10-07 | 0.25 | 0.35 | 0.44 | 0.69 |
| 2020-10-08 | 0.25 | 0.35 | 0.44 | 0.65 |
| 2020-10-09 | 0.25 | 0.35 | 0.44 | 0.63 |
| 2020-10-12 | 0.25 | 0.35 | 0.43 | 0.62 |
| 2020-10-13 | 0.25 | 0.35 | 0.43 | 0.57 |
| 2020-10-14 | 0.25 | 0.35 | 0.43 | 0.59 |
| 2020-10-15 | 0.25 | 0.35 | 0.43 | 0.57 |
| 2020-10-16 | 0.25 | 0.35 | 0.43 | 0.58 |
| 2020-10-19 | 0.25 | 0.35 | 0.43 | 0.6 |
| 2020-10-20 | 0.25 | 0.35 | 0.43 | 0.6 |
| 2020-10-21 | 0.25 | 0.35 | 0.43 | 0.63 |
| 2020-10-22 | 0.25 | 0.35 | 0.43 | 0.62 |
| 2020-10-23 | 0.25 | 0.35 | 0.43 | 0.61 |
| 2020-10-26 | 0.25 | 0.35 | 0.43 | 0.59 |
| 2020-10-27 | 0.25 | 0.35 | 0.42 | 0.58 |
| 2020-10-29 | 0.25 | 0.35 | 0.42 | 0.58 |
| 2020-10-30 | 0.25 | 0.35 | 0.42 | 0.57 |